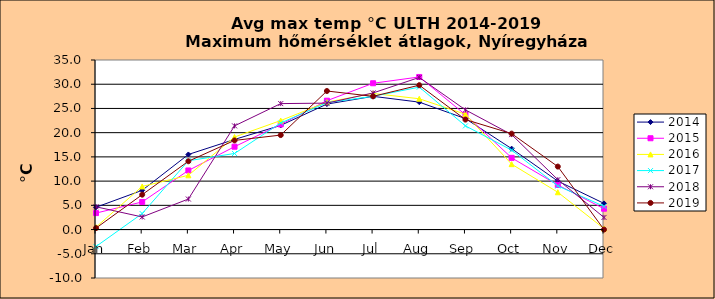
| Category | 2014 | 2015 | 2016 | 2017 | 2018 | 2019 |
|---|---|---|---|---|---|---|
| Jan | 4.6 | 3.4 | 0.5 | -3.5 | 4.7 | 0.3 |
| Feb | 8.1 | 5.7 | 8.9 | 3.3 | 2.6 | 7.2 |
| Mar | 15.5 | 12.2 | 11.2 | 14.2 | 6.3 | 14.1 |
| Apr | 18.6 | 17.1 | 19.1 | 15.7 | 21.4 | 18.4 |
| May | 21.5 | 21.7 | 22.5 | 22 | 26 | 19.5 |
| Jun | 25.9 | 26.6 | 26.3 | 26.2 | 26.1 | 28.6 |
| Jul | 27.5 | 30.2 | 28.1 | 27.5 | 28.2 | 27.5 |
| Aug | 26.3 | 31.5 | 27 | 29.4 | 31.4 | 29.8 |
| Sep | 22.9 | 23.7 | 23.8 | 21.4 | 24.7 | 22.7 |
| Oct | 16.7 | 14.8 | 13.5 | 16.4 | 19.6 | 19.8 |
| Nov | 10 | 9.2 | 7.7 | 9 | 10.3 | 13 |
| Dec | 5.4 | 4.3 | 0.2 | 4.8 | 2.5 | 0 |